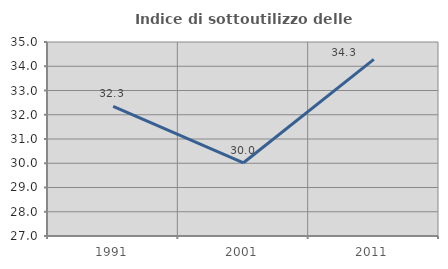
| Category | Indice di sottoutilizzo delle abitazioni  |
|---|---|
| 1991.0 | 32.341 |
| 2001.0 | 30.019 |
| 2011.0 | 34.283 |